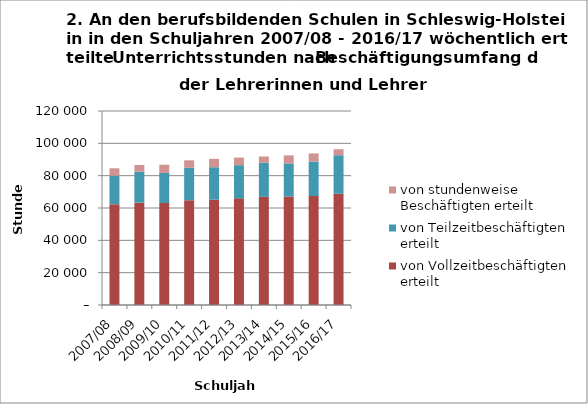
| Category | von Vollzeitbeschäftigten erteilt | von Teilzeitbeschäftigten erteilt | von stundenweise Beschäftigten erteilt |
|---|---|---|---|
| 2007/08 | 62310 | 17717 | 4535 |
| 2008/09 | 63318 | 19143 | 4127 |
| 2009/10 | 63082 | 18601 | 5100 |
| 2010/11 | 64821 | 20032 | 4645 |
| 2011/12 | 65119 | 20107 | 5192 |
| 2012/13 | 65972 | 20520 | 4659 |
| 2013/14 | 66913 | 21100 | 3862 |
| 2014/15 | 67101.5 | 20464.1 | 4987.2 |
| 2015/16 | 67369.2 | 21390.4 | 5010.3 |
| 2016/17 | 68815.6 | 23834.2 | 3717.5 |